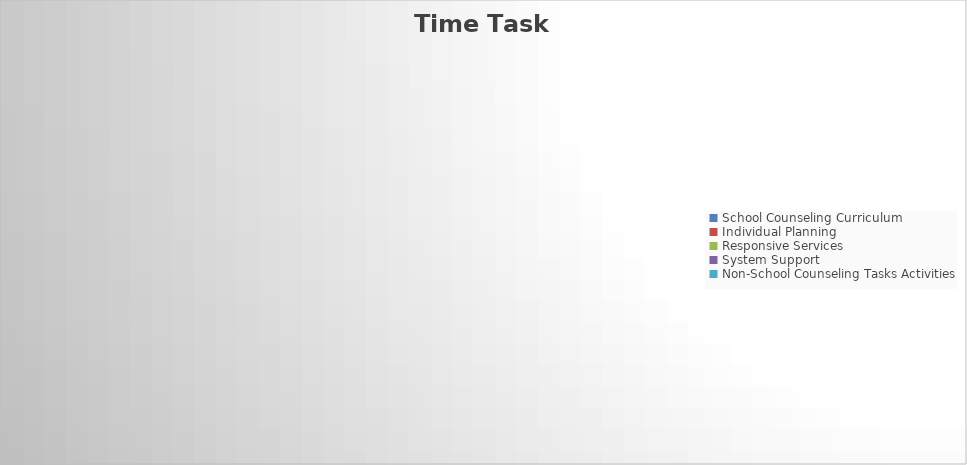
| Category | Series 0 | Series 1 |
|---|---|---|
| School Counseling Curriculum |  | 0 |
| Individual Planning |  | 0 |
| Responsive Services |  | 0 |
| System Support |  | 0 |
| Non-School Counseling Tasks Activities |  | 0 |